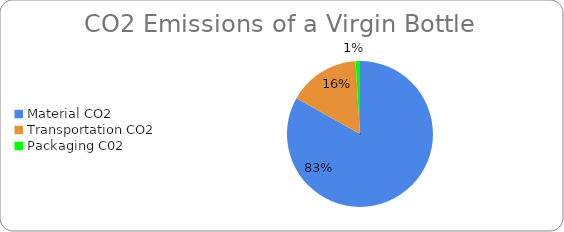
| Category | Series 0 |
|---|---|
| Material CO2 | 0.269 |
| Transportation CO2 | 0.051 |
| Packaging C02 | 0.003 |